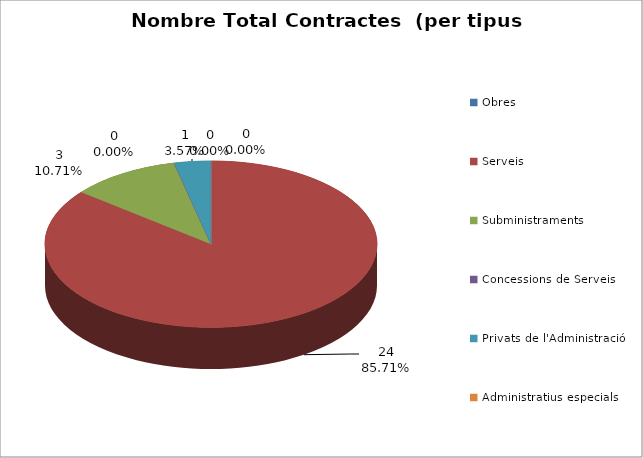
| Category | Nombre Total Contractes |
|---|---|
| Obres | 0 |
| Serveis | 24 |
| Subministraments | 3 |
| Concessions de Serveis | 0 |
| Privats de l'Administració | 1 |
| Administratius especials | 0 |